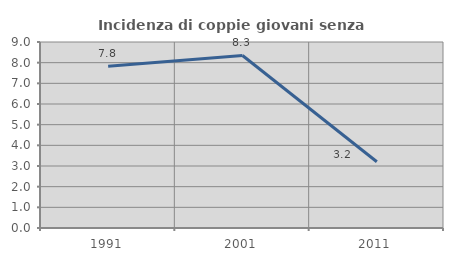
| Category | Incidenza di coppie giovani senza figli |
|---|---|
| 1991.0 | 7.821 |
| 2001.0 | 8.347 |
| 2011.0 | 3.203 |